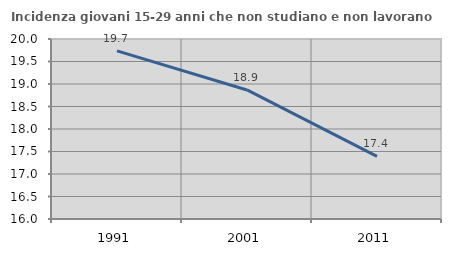
| Category | Incidenza giovani 15-29 anni che non studiano e non lavorano  |
|---|---|
| 1991.0 | 19.737 |
| 2001.0 | 18.868 |
| 2011.0 | 17.391 |